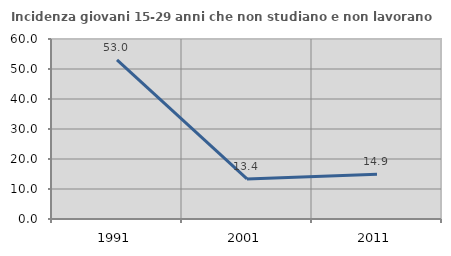
| Category | Incidenza giovani 15-29 anni che non studiano e non lavorano  |
|---|---|
| 1991.0 | 53.014 |
| 2001.0 | 13.372 |
| 2011.0 | 14.876 |